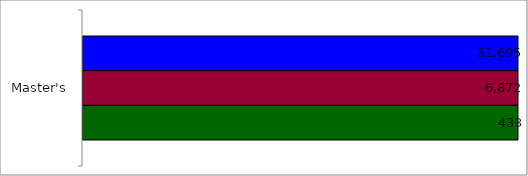
| Category | 50 states and D.C. | SREB states | State |
|---|---|---|---|
| Master's | 31695 | 6872 | 433 |